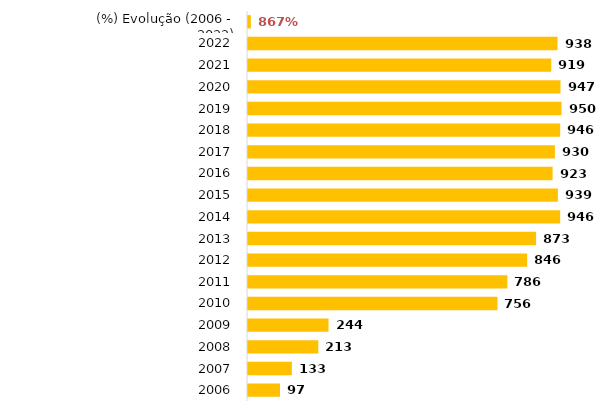
| Category | Téc. Adm. |
|---|---|
| 2006 | 97 |
| 2007 | 133 |
| 2008 | 213 |
| 2009 | 244 |
| 2010 | 756 |
| 2011 | 786 |
| 2012 | 846 |
| 2013 | 873 |
| 2014 | 946 |
| 2015 | 939 |
| 2016 | 923 |
| 2017 | 930 |
| 2018 | 946 |
| 2019 | 950 |
| 2020 | 947 |
| 2021 | 919 |
| 2022 | 938 |
| (%) Evolução (2006 - 2022) | 8.67 |